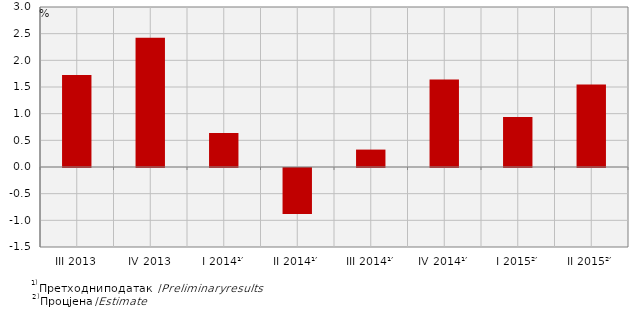
| Category | Стопе реалног раста БДП-а
Real growth rates of GDP |
|---|---|
| III 2013 | 1.725 |
| IV 2013 | 2.424 |
| I 2014¹′ | 0.638 |
| II 2014¹′ | -0.864 |
| III 2014¹′ | 0.327 |
| IV 2014¹′ | 1.643 |
| I 2015²′ | 0.939 |
| II 2015²′ | 1.549 |